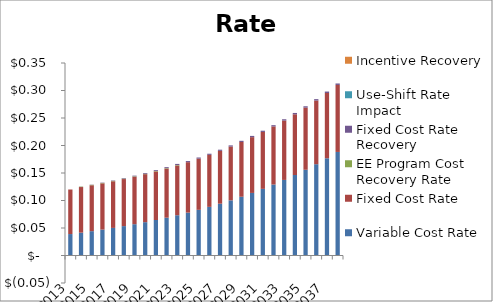
| Category | Variable Cost Rate | Fixed Cost Rate | EE Program Cost Recovery Rate | Fixed Cost Rate Recovery | Use-Shift Rate Impact | Incentive Recovery |
|---|---|---|---|---|---|---|
| 2013.0 | 0.039 | 0.081 | 0 | 0 | 0 | 0 |
| 2014.0 | 0.042 | 0.083 | 0.001 | 0 | 0 | 0 |
| 2015.0 | 0.044 | 0.083 | 0.001 | 0 | 0 | 0 |
| 2016.0 | 0.047 | 0.084 | 0.001 | 0.001 | 0 | 0 |
| 2017.0 | 0.05 | 0.085 | 0.001 | 0.001 | 0 | 0 |
| 2018.0 | 0.053 | 0.086 | 0.001 | 0.001 | 0 | 0 |
| 2019.0 | 0.057 | 0.086 | 0.001 | 0.001 | 0 | 0 |
| 2020.0 | 0.061 | 0.087 | 0.001 | 0.001 | 0 | 0 |
| 2021.0 | 0.065 | 0.088 | 0.001 | 0.002 | 0 | 0 |
| 2022.0 | 0.069 | 0.089 | 0.001 | 0.002 | -0.001 | 0 |
| 2023.0 | 0.073 | 0.09 | 0.001 | 0.002 | -0.001 | 0 |
| 2024.0 | 0.078 | 0.092 | 0 | 0.002 | 0 | 0 |
| 2025.0 | 0.083 | 0.093 | 0 | 0.002 | 0 | 0 |
| 2026.0 | 0.088 | 0.095 | 0 | 0.002 | 0 | 0 |
| 2027.0 | 0.094 | 0.096 | 0 | 0.002 | 0 | 0 |
| 2028.0 | 0.1 | 0.098 | 0 | 0.002 | 0 | 0 |
| 2029.0 | 0.107 | 0.1 | 0 | 0.002 | 0 | 0 |
| 2030.0 | 0.114 | 0.101 | 0 | 0.002 | 0 | 0 |
| 2031.0 | 0.121 | 0.103 | 0 | 0.002 | 0 | 0 |
| 2032.0 | 0.129 | 0.106 | 0 | 0.002 | 0 | 0 |
| 2033.0 | 0.137 | 0.108 | 0 | 0.002 | 0 | 0 |
| 2034.0 | 0.146 | 0.11 | 0 | 0.002 | 0 | 0 |
| 2035.0 | 0.156 | 0.113 | 0 | 0.003 | 0 | 0 |
| 2036.0 | 0.166 | 0.116 | 0 | 0.003 | 0 | 0 |
| 2037.0 | 0.177 | 0.119 | 0 | 0.003 | 0 | 0 |
| 2038.0 | 0.188 | 0.122 | 0 | 0.003 | 0 | 0 |